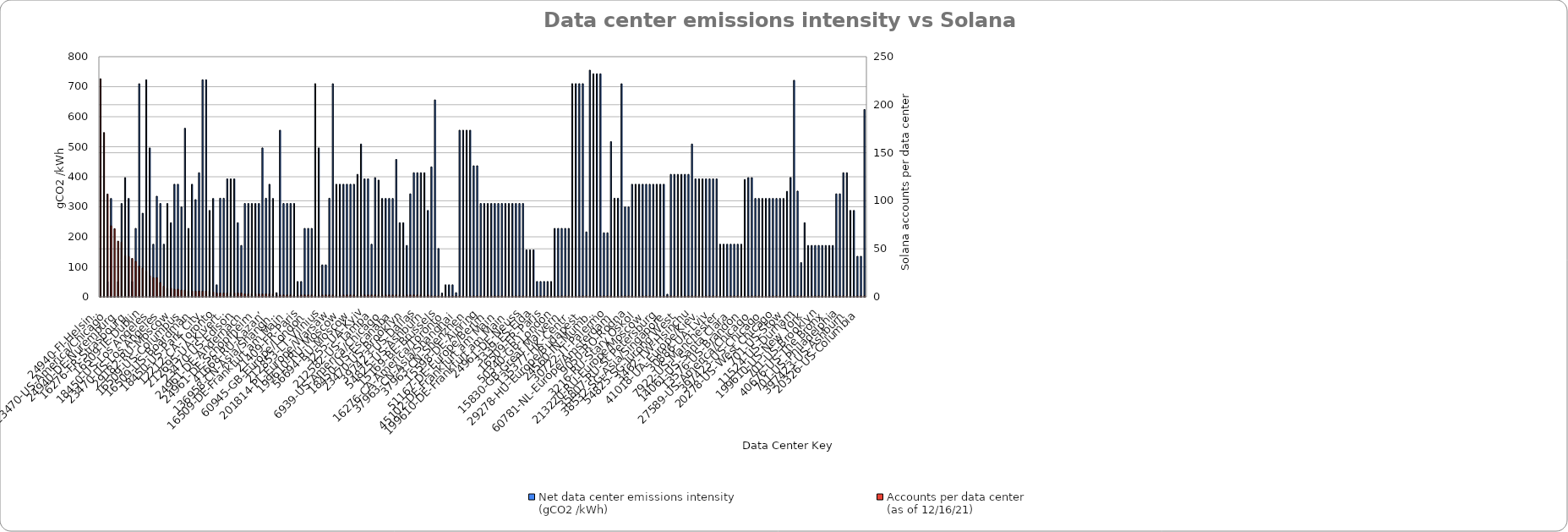
| Category | Net data center emissions intensity
(gCO2 /kWh) |
|---|---|
| 24940-FI-Helsinki | 0 |
| 24940-DE-Falkenstein | 0 |
| 16276-FR-Roubaix | 51.1 |
| 23470-US-America/Chicago | 327.7 |
| 16276-CA-Beauharnois | 1.2 |
| 16276-FR-Gravelines | 51.1 |
| 24940-DE-Nuremburg | 311 |
| 23470-US-Miami | 397.1 |
| 18450-US-America/Chicago | 327.7 |
| 16276-FR-Strasbourg | 51.1 |
| 16276-EN-London | 228 |
| 16276-PL-Warsaw | 709.8 |
| 16509-IE-Dublin | 278.6 |
| 18450-US-Ogden | 723 |
| 16509-JP-Tokyo | 496 |
| 18450-US-Los Angeles | 175.3 |
| 23470-US-Las Vegas | 335.2 |
| 24961-DE-Europe/Berlin | 311 |
| 23470-US-Los Angeles | 175.3 |
| 51167-DE-Düsseldorf | 311 |
| 23470-US-Piscataway | 246.9 |
| 29182-RU-Moscow | 375 |
| 56694-RU-Europe/Moscow | 375 |
| 9009-RO-Bucharest | 299.5 |
| 16509-US-Columbus | 561.6 |
| 58061-GB-Europe/London | 228 |
| 15440-RU-Europe/Moscow | 375 |
| 16509-US-Boardman | 324 |
| 13830-US-Dallas | 413.4 |
| 18450-US-Clearfield | 723 |
| 18450-US-Park City | 723 |
| 14618-US-Ashburn | 287.8 |
| 22612-US-America/Chicago | 327.7 |
| 12212-CA-Toronto | 40 |
| 54825-NL-Amsterdam | 328.4 |
| 54825-NL-Schiphol | 328.4 |
| 212695-UA-Kivertsi | 393 |
| 35320-UA-Lviv | 393 |
| 59577-UA-Lviv | 393 |
| 23470-US-Edison | 246.9 |
| 23470-US-New York | 171.2 |
| 197071-DE-Europe/Berlin | 311 |
| 24961-DE-Andernach | 311 |
| 16276-DE-Frankfurt | 311 |
| 199610-DE-Frankfurt | 311 |
| 24961-DE-Schopfheim | 311 |
| 54825-JP-Tokyo | 496 |
| 20326-NL-Amsterdam | 328.4 |
| 41668-RU-Kazan’ | 375 |
| 14618-US-America/Chicago | 327.7 |
| 13030-CH-Aarburg | 14 |
| 136958-CN-Asia/Shanghai | 555 |
| 24940-DE-Europe/Berlin | 311 |
| 48314-DE-Europe/Berlin | 311 |
| 16509-DE-Frankfurt am Main | 311 |
| 199610-DE-Karlsruhe | 311 |
| 21409-FR-Europe/Paris | 51.1 |
| 21409-FR-Paris | 51.1 |
| 16509-GB-London | 228 |
| 55081-GB-London | 228 |
| 60945-GB-Europe/London | 228 |
| 23881-HK-Asia/Hong_Kong | 710 |
| 45102-JP-Tokyo | 496 |
| 212853-LT-Vilnius | 106.5 |
| 2588-LV-Riga | 106.5 |
| 59711-NL-Europe/Amsterdam | 328.4 |
| 201814-PL-Europe/Warsaw | 709.8 |
| 28832-RU-Chelyabinsk | 375 |
| 57128-RU-Kazan’ | 375 |
| 199610-RU-Moscow | 375 |
| 50867-RU-Europe/Moscow | 375 |
| 29182-RU-Europe/Moscow | 375 |
| 56694-RU-Moscow | 375 |
| 16509-SG-Singapore | 408 |
| 15169-TW-New Taipei | 509 |
| 3255-UA-Kyiv | 393 |
| 3255-UA-Lviv | 393 |
| 54825-US-Los Angeles | 175.3 |
| 212582-US-Tampa | 397.1 |
| 15169-US-Council Bluffs | 388.9 |
| 40021-US-America/Chicago | 327.7 |
| 6939-US-America/Chicago | 327.7 |
| 8560-US-America/Chicago | 327.7 |
| 19318-US-America/Chicago | 327.7 |
| 18450-US-Escanaba | 457.7 |
| 18450-US-Penns Grove | 246.9 |
| 54825-US-Secaucus | 246.9 |
| 23470-US-Brooklyn | 171.2 |
| 20326-US-Pittsburgh | 343.1 |
| 393398-US-Dallas | 413.4 |
| 397423-US-Dallas | 413.4 |
| 3900-US-Kyle | 413.4 |
| 393398-US-Irving | 413.4 |
| 54825-US-Ashburn | 287.8 |
| 200851-AE-Dubai | 433 |
| 4804-AU-Coorparoo | 656 |
| 15169-BE-Brussels | 161 |
| 6939-CA-Vancouver | 12.9 |
| 396477-CA-Ottawa | 40 |
| 16276-CA-America/Toronto | 40 |
| 54825-CA-Toronto | 40 |
| 207143-CH-Richterswil | 14 |
| 37963-CN-Asia/Shanghai | 555 |
| 56047-CN-Asia/Shanghai | 555 |
| 37963-CN-Beijing | 555 |
| 37963-CN-Shenzhen | 555 |
| 201730-CZ-Europe/Prague | 436.6 |
| 202618-CZ-Prague | 436.6 |
| 15598-DE-Ainring | 311 |
| 30823-DE-Europe/Berlin | 311 |
| 213250-DE-Europe/Berlin | 311 |
| 51167-DE-Europe/Berlin | 311 |
| 24961-DE-Düsseldorf | 311 |
| 15169-DE-Frankfurt am Main | 311 |
| 45102-DE-Frankfurt am Main | 311 |
| 54825-DE-Frankfurt am Main | 311 |
| 8220-DE-Frankfurt am Main | 311 |
| 199610-DE-Frankfurt am Main | 311 |
| 24961-DE-Lauchhammer | 311 |
| 15830-DE-Munich | 311 |
| 24961-DE-Neuss | 311 |
| 54825-ES-Madrid | 156.4 |
| 8560-ES-Sant Just Desvern | 156.4 |
| 3339-ES-Elda | 156.4 |
| 35661-FR-Lille | 51.1 |
| 54825-FR-Pantin | 51.1 |
| 16509-FR-Paris | 51.1 |
| 12876-FR-Paris | 51.1 |
| 54825-FR-Marseille | 51.1 |
| 50340-GB-London | 228 |
| 41477-GB-Notting Hill Gate | 228 |
| 31463-GB-Hayes | 228 |
| 15830-GB-Great Malvern | 228 |
| 211091-GB-Stanmore | 228 |
| 54825-HK-Central | 710 |
| 135377-HK-Central | 710 |
| 9381-HK-Wong Tai Sin | 710 |
| 54825-HK-Nai Chung | 710 |
| 29278-HU-Europe/Budapest | 216.4 |
| 139190-ID-Jakarta | 755 |
| 16509-IN-Mumbai | 743 |
| 24560-IN-Mumbai | 743 |
| 206264-SC-Indian/Mahe | 743 |
| 30722-IT-Brusaporto | 213.4 |
| 30722-IT-Palermo | 213.4 |
| 4766-KR-Yongdu-dong | 517 |
| 57043-NL-Amsterdam | 328.4 |
| 60781-NL-Europe/Amsterdam | 328.4 |
| 39507-PL-Nowe Chechlo | 709.8 |
| 9009-RO-Europe/Bucharest | 299.5 |
| 9050-RO-Rodna | 299.5 |
| 41661-RU-Chelyabinsk | 375 |
| 3216-RU-Kostroma | 375 |
| 3216-RU-Stary Oskol | 375 |
| 35810-RU-Khimki | 375 |
| 47433-RU-Leninsk-Kuznetsky | 375 |
| 213220-RU-Europe/Moscow | 375 |
| 29319-RU-Moscow | 375 |
| 57487-RU-Europe/Moscow | 375 |
| 35807-RU-St Petersburg | 375 |
| 57378-RU-Rostov-on-Don | 375 |
| 16509-SE-Stockholm | 8.8 |
| 38532-SG-Asia/Singapore | 408 |
| 4657-SG-Singapore | 408 |
| 54825-SG-Asia/Singapore | 408 |
| 54825-SG-Jurong West | 408 |
| 54825-SG-Queenstown Estate | 408 |
| 55430-SG-Singapore | 408 |
| 3462-TW-Hsinchu | 509 |
| 15497-UA-Europe/Kiev | 393 |
| 56485-UA-Kyiv | 393 |
| 41018-UA-Europe/Kiev | 393 |
| 21257-UA-Europe/Kiev | 393 |
| 57197-UA-Dnipro | 393 |
| 30886-UA-Lviv | 393 |
| 51500-UA-Lviv | 393 |
| 20326-US-Los Angeles | 175.3 |
| 7922-US-Manchester | 175.3 |
| 18450-US-Marina del Rey | 175.3 |
| 20115-US-Pasadena | 175.3 |
| 14061-US-Santa Clara | 175.3 |
| 54825-US-Santa Clara | 175.3 |
| 132203-US-Santa Clara | 175.3 |
| 13576-US-Brandon | 391 |
| 23470-US-Fort Lauderdale | 397.1 |
| 5650-US-Palm Harbor | 397.1 |
| 27589-US-America/Chicago | 327.7 |
| 32097-US-America/Chicago | 327.7 |
| 3356-US-America/Chicago | 327.7 |
| 397423-US-Chicago | 327.7 |
| 40676-US-America/Chicago | 327.7 |
| 396998-US-America/Chicago | 327.7 |
| 20278-US-West Chicago | 327.7 |
| 7018-US-Channahon | 327.7 |
| 53264-US-Huntley | 327.7 |
| 701-US-Stow | 351.4 |
| 209-US-Minneapolis | 397.6 |
| 40021-US-St Louis | 721.3 |
| 11524-US-Durham | 352.3 |
| 7922-US-Manchester | 114.1 |
| 55286-US-Piscataway | 246.9 |
| 199610-US-New York | 171.2 |
| 19318-US-New York | 171.2 |
| 22439-US-Orchard Park | 171.2 |
| 701-US-Brooklyn | 171.2 |
| 23470-US-The Bronx | 171.2 |
| 40676-US-New York | 171.2 |
| 40676-US-The Bronx | 171.2 |
| 701-US-Scarsdale | 171.2 |
| 20473-US-Dallastown | 343.1 |
| 701-US-Philadelphia | 343.1 |
| 16591-US-Austin | 413.4 |
| 54825-US-Dallas | 413.4 |
| 397423-US-Ashburn | 287.8 |
| 40676-US-Ashburn | 287.8 |
| 20055-US-Redmond | 135.1 |
| 20326-US-Columbia | 135.1 |
| 45899-VN-Hanoi | 624 |